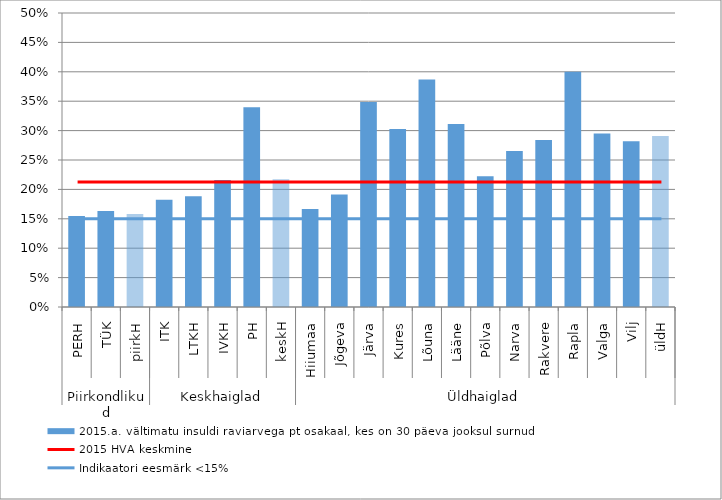
| Category | 2015.a. vältimatu insuldi raviarvega pt osakaal, kes on 30 päeva jooksul surnud |
|---|---|
| 0 | 0.155 |
| 1 | 0.163 |
| 2 | 0.158 |
| 3 | 0.183 |
| 4 | 0.188 |
| 5 | 0.216 |
| 6 | 0.34 |
| 7 | 0.217 |
| 8 | 0.167 |
| 9 | 0.191 |
| 10 | 0.348 |
| 11 | 0.303 |
| 12 | 0.387 |
| 13 | 0.311 |
| 14 | 0.222 |
| 15 | 0.265 |
| 16 | 0.284 |
| 17 | 0.4 |
| 18 | 0.295 |
| 19 | 0.282 |
| 20 | 0.291 |